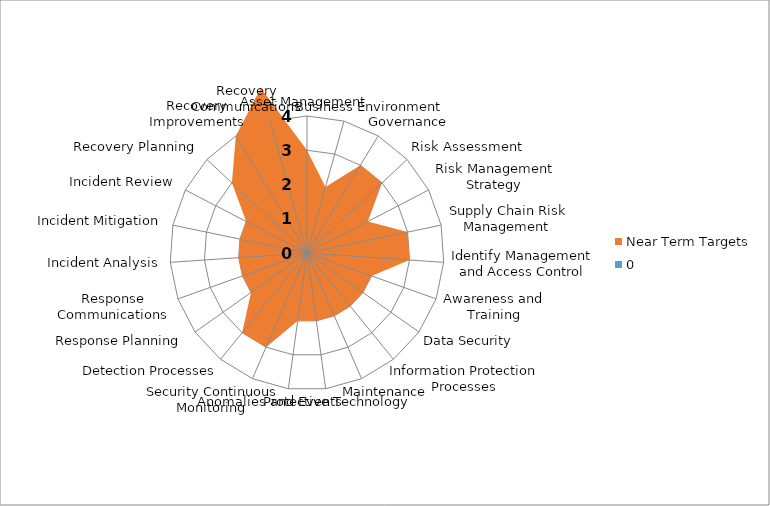
| Category | Near Term Targets | 0 |
|---|---|---|
| Asset Management | 3 | 0 |
| Business Environment | 2 | 0 |
| Governance | 3 | 0 |
| Risk Assessment | 3 | 0 |
| Risk Management Strategy | 2 | 0 |
| Supply Chain Risk Management  | 3 | 0 |
| Identify Management and Access Control | 3 | 0 |
| Awareness and Training | 2 | 0 |
| Data Security | 2 | 0 |
| Information Protection Processes | 2 | 0 |
| Maintenance | 2 | 0 |
| Protective Technology | 2 | 0 |
| Anomalies and Events | 2 | 0 |
| Security Continuous Monitoring  | 3 | 0 |
| Detection Processes  | 3 | 0 |
| Response Planning  | 2 | 0 |
| Response Communications | 2 | 0 |
| Incident Analysis | 2 | 0 |
| Incident Mitigation | 2 | 0 |
| Incident Review | 2 | 0 |
| Recovery Planning | 3 | 0 |
| Recovery Improvements | 4 | 0 |
| Recovery Communications | 5 | 0 |